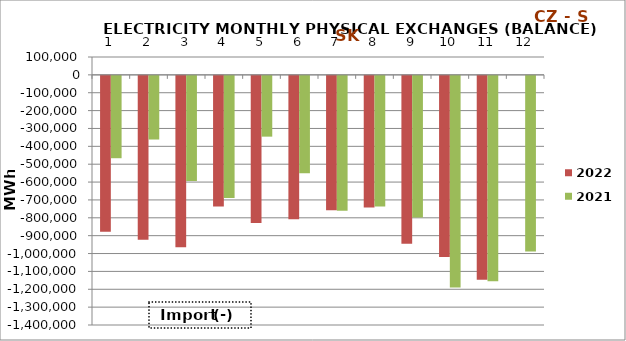
| Category | 2022 | 2021 |
|---|---|---|
| 0 | -871895.95 | -460919.925 |
| 1 | -916818.85 | -356310.15 |
| 2 | -958606.05 | -588025.5 |
| 3 | -731552.6 | -683843.8 |
| 4 | -823678.25 | -340196.575 |
| 5 | -801866.15 | -544566.275 |
| 6 | -751923.41 | -754326.65 |
| 7 | -736515.35 | -731063.375 |
| 8 | -939380.875 | -792137.15 |
| 9 | -1013315.95 | -1184871.175 |
| 10 | -1141454.1 | -1149407.25 |
| 11 | 0 | -982556.85 |